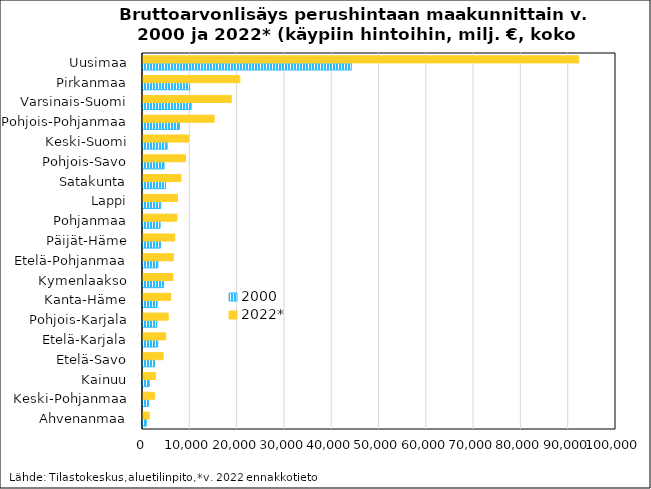
| Category | 2000 | 2022* |
|---|---|---|
| Ahvenanmaa | 706.5 | 1313.2 |
| Keski-Pohjanmaa | 1151.4 | 2415.2 |
| Kainuu | 1313.9 | 2659.1 |
| Etelä-Savo | 2425.5 | 4269.1 |
| Etelä-Karjala | 3098.7 | 4820 |
| Pohjois-Karjala | 2931.9 | 5335.3 |
| Kanta-Häme | 2987.9 | 5851 |
| Kymenlaakso | 4322.4 | 6323.4 |
| Etelä-Pohjanmaa | 3132.8 | 6426.6 |
| Päijät-Häme | 3712.4 | 6717 |
| Pohjanmaa | 3619.7 | 7184.5 |
| Lappi | 3741.5 | 7291.8 |
| Satakunta | 4765 | 8025.7 |
| Pohjois-Savo | 4445.3 | 9000.7 |
| Keski-Suomi | 5103.8 | 9641.7 |
| Pohjois-Pohjanmaa | 7705.5 | 15045.5 |
| Varsinais-Suomi | 10193.6 | 18649.8 |
| Pirkanmaa | 9872.4 | 20476.4 |
| Uusimaa | 44035.5 | 92124.4 |